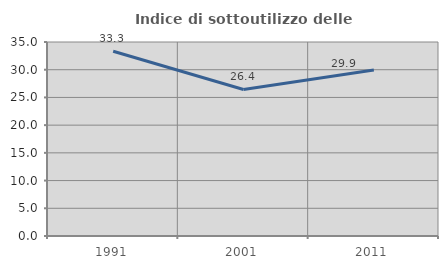
| Category | Indice di sottoutilizzo delle abitazioni  |
|---|---|
| 1991.0 | 33.333 |
| 2001.0 | 26.439 |
| 2011.0 | 29.938 |